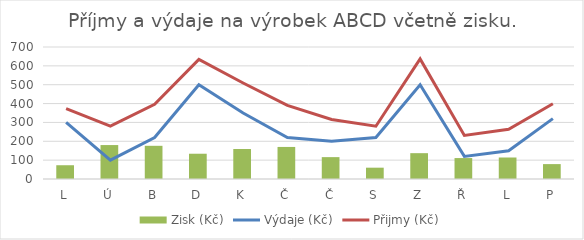
| Category | Zisk (Kč) |
|---|---|
| L | 73 |
| Ú | 180 |
| B | 176 |
| D | 134 |
| K | 159 |
| Č | 170 |
| Č | 116 |
| S | 60 |
| Z | 137 |
| Ř | 111 |
| L | 114 |
| P | 79 |